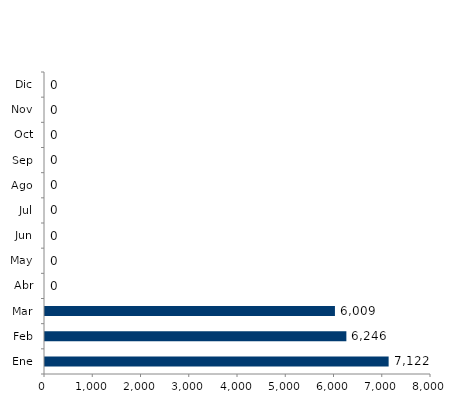
| Category | Series 0 |
|---|---|
| Ene | 7122 |
| Feb | 6246 |
| Mar | 6009 |
| Abr | 0 |
| May | 0 |
| Jun | 0 |
| Jul | 0 |
| Ago | 0 |
| Sep | 0 |
| Oct | 0 |
| Nov | 0 |
| Dic | 0 |